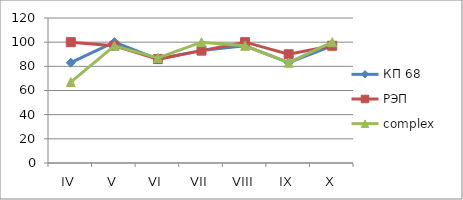
| Category | КП 68 | РЭП  | complex |
|---|---|---|---|
| IV | 83 | 100 | 67 |
| V | 100 | 97 | 97 |
| VI | 86 | 86 | 87 |
| VII | 93 | 93 | 100 |
| VIII | 97 | 100 | 97 |
| IX | 83 | 90 | 83 |
| X | 97 | 97 | 100 |